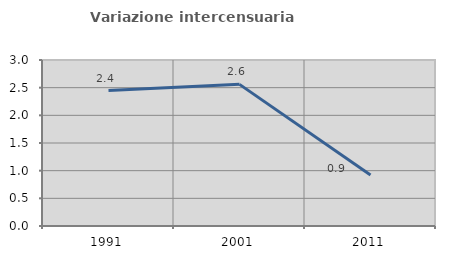
| Category | Variazione intercensuaria annua |
|---|---|
| 1991.0 | 2.447 |
| 2001.0 | 2.56 |
| 2011.0 | 0.92 |